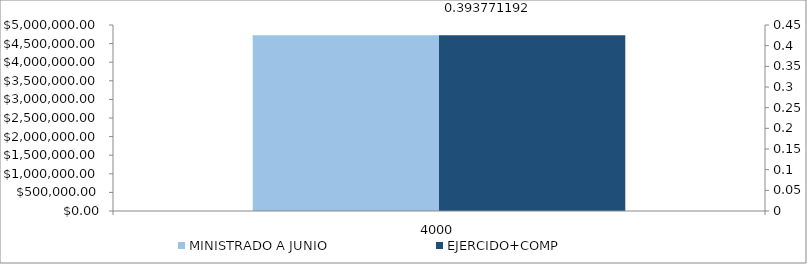
| Category | MINISTRADO A JUNIO | EJERCIDO+COMP |
|---|---|---|
| 4000.0 | 4723555.75 | 4723555.75 |